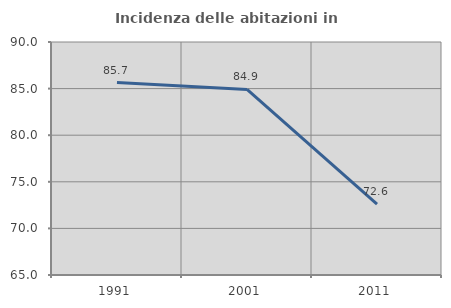
| Category | Incidenza delle abitazioni in proprietà  |
|---|---|
| 1991.0 | 85.651 |
| 2001.0 | 84.907 |
| 2011.0 | 72.616 |